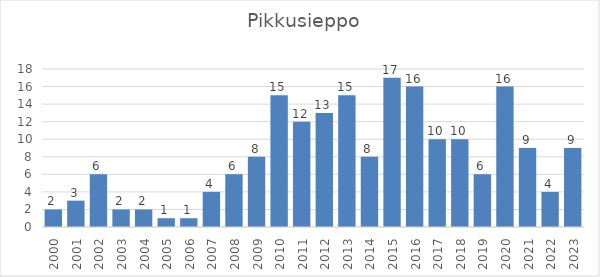
| Category | Series 0 |
|---|---|
| 2000.0 | 2 |
| 2001.0 | 3 |
| 2002.0 | 6 |
| 2003.0 | 2 |
| 2004.0 | 2 |
| 2005.0 | 1 |
| 2006.0 | 1 |
| 2007.0 | 4 |
| 2008.0 | 6 |
| 2009.0 | 8 |
| 2010.0 | 15 |
| 2011.0 | 12 |
| 2012.0 | 13 |
| 2013.0 | 15 |
| 2014.0 | 8 |
| 2015.0 | 17 |
| 2016.0 | 16 |
| 2017.0 | 10 |
| 2018.0 | 10 |
| 2019.0 | 6 |
| 2020.0 | 16 |
| 2021.0 | 9 |
| 2022.0 | 4 |
| 2023.0 | 9 |